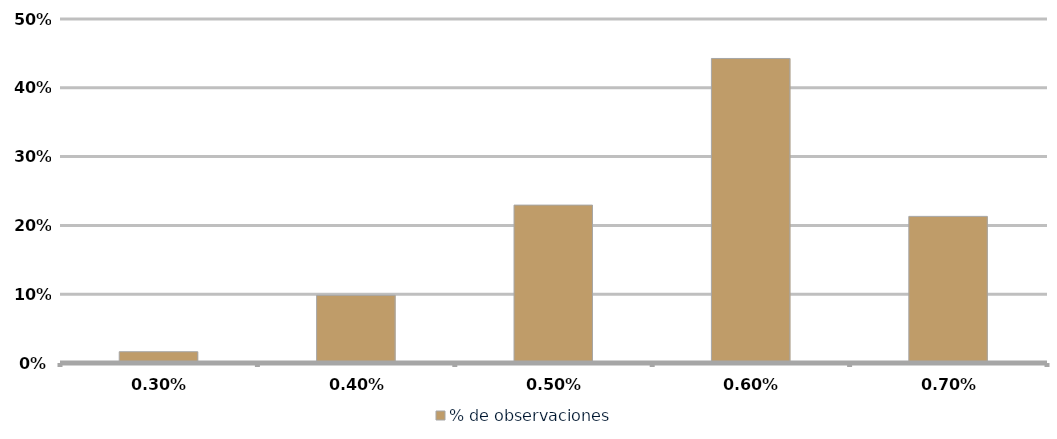
| Category | % de observaciones  |
|---|---|
| 0.003 | 0.016 |
| 0.004 | 0.098 |
| 0.005 | 0.23 |
| 0.006 | 0.443 |
| 0.007 | 0.213 |